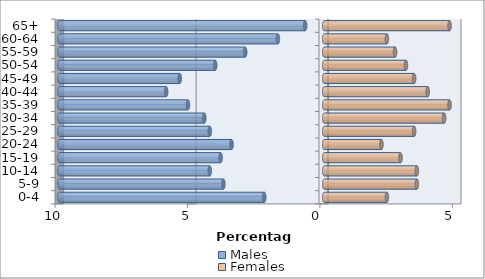
| Category | Males | Females |
|---|---|---|
| 0-4 | -2.263 | 2.366 |
| 5-9 | -3.807 | 3.498 |
| 10-14 | -4.321 | 3.498 |
| 15-19 | -3.909 | 2.881 |
| 20-24 | -3.498 | 2.16 |
| 25-29 | -4.321 | 3.395 |
| 30-34 | -4.527 | 4.527 |
| 35-39 | -5.144 | 4.733 |
| 40-44 | -5.967 | 3.909 |
| 45-49 | -5.453 | 3.395 |
| 50-54 | -4.115 | 3.086 |
| 55-59 | -2.984 | 2.675 |
| 60-64 | -1.749 | 2.366 |
| 65+ | -0.72 | 4.733 |